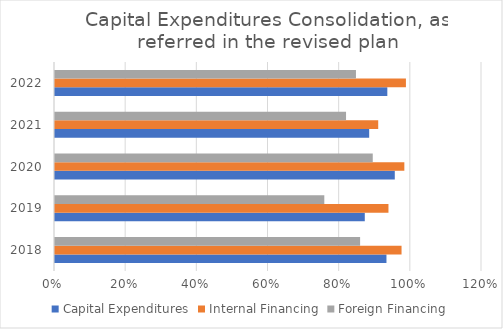
| Category | Capital Expenditures | Internal Financing | Foreign Financing |
|---|---|---|---|
| 2018.0 | 0.932 | 0.974 | 0.857 |
| 2019.0 | 0.871 | 0.937 | 0.757 |
| 2020.0 | 0.955 | 0.982 | 0.893 |
| 2021.0 | 0.883 | 0.908 | 0.818 |
| 2022.0 | 0.934 | 0.986 | 0.846 |